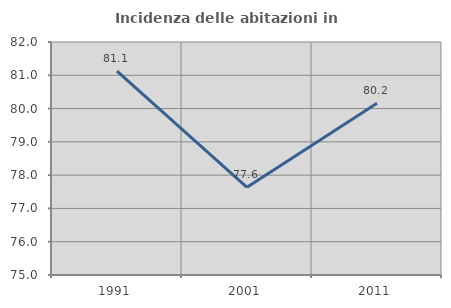
| Category | Incidenza delle abitazioni in proprietà  |
|---|---|
| 1991.0 | 81.127 |
| 2001.0 | 77.634 |
| 2011.0 | 80.16 |